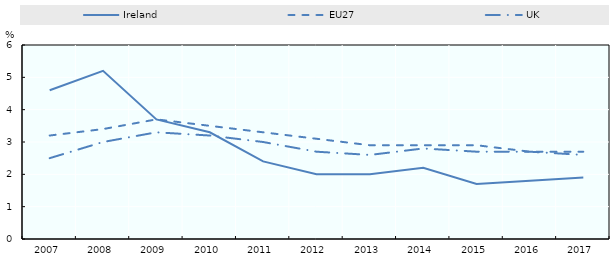
| Category | Ireland | EU27 | UK |
|---|---|---|---|
| 2007.0 | 4.6 | 3.2 | 2.5 |
| 2008.0 | 5.2 | 3.4 | 3 |
| 2009.0 | 3.7 | 3.7 | 3.3 |
| 2010.0 | 3.3 | 3.5 | 3.2 |
| 2011.0 | 2.4 | 3.3 | 3 |
| 2012.0 | 2 | 3.1 | 2.7 |
| 2013.0 | 2 | 2.9 | 2.6 |
| 2014.0 | 2.2 | 2.9 | 2.8 |
| 2015.0 | 1.7 | 2.9 | 2.7 |
| 2016.0 | 1.8 | 2.7 | 2.7 |
| 2017.0 | 1.9 | 2.7 | 2.6 |